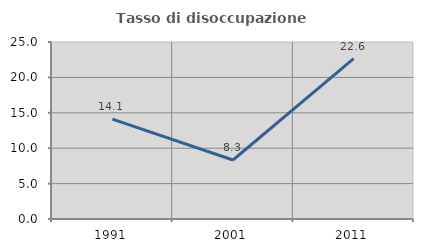
| Category | Tasso di disoccupazione giovanile  |
|---|---|
| 1991.0 | 14.113 |
| 2001.0 | 8.333 |
| 2011.0 | 22.642 |